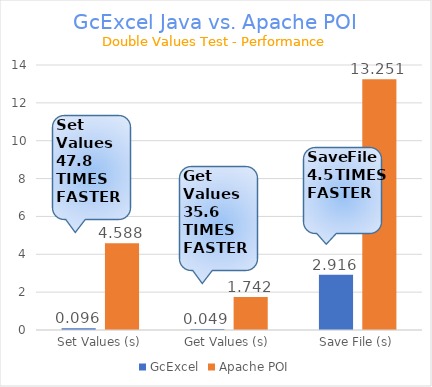
| Category | GcExcel | Apache POI |
|---|---|---|
| Set Values (s) | 0.096 | 4.588 |
| Get Values (s) | 0.049 | 1.742 |
| Save File (s) | 2.916 | 13.251 |